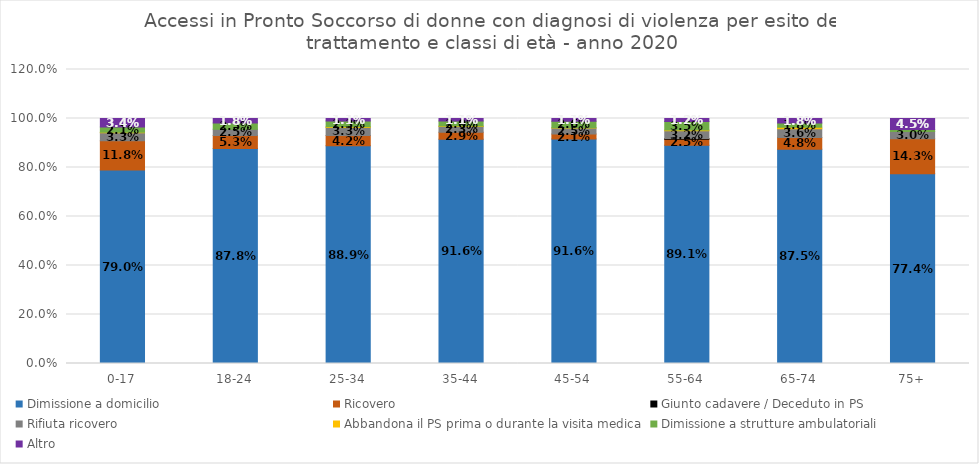
| Category | Dimissione a domicilio | Ricovero  | Giunto cadavere / Deceduto in PS | Rifiuta ricovero | Abbandona il PS prima o durante la visita medica | Dimissione a strutture ambulatoriali | Altro |
|---|---|---|---|---|---|---|---|
| 0-17 | 0.79 | 0.118 | 0 | 0.033 | 0.003 | 0.021 | 0.034 |
| 18-24 | 0.878 | 0.053 | 0 | 0.025 | 0 | 0.025 | 0.018 |
| 25-34 | 0.889 | 0.042 | 0 | 0.033 | 0.003 | 0.023 | 0.011 |
| 35-44 | 0.916 | 0.029 | 0 | 0.023 | 0.002 | 0.02 | 0.011 |
| 45-54 | 0.916 | 0.021 | 0 | 0.025 | 0.001 | 0.026 | 0.011 |
| 55-64 | 0.891 | 0.025 | 0.002 | 0.032 | 0.002 | 0.035 | 0.012 |
| 65-74 | 0.875 | 0.048 | 0 | 0.036 | 0.006 | 0.018 | 0.018 |
| 75+ | 0.774 | 0.143 | 0 | 0.03 | 0 | 0.008 | 0.045 |